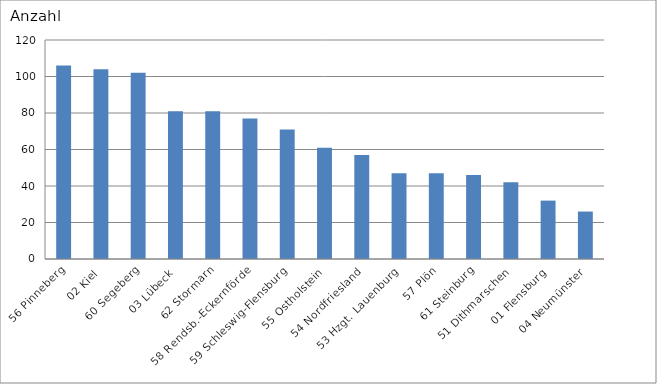
| Category | 56 Pinneberg 02 Kiel 60 Segeberg 03 Lübeck 62 Stormarn 58 Rendsb.-Eckernförde 59 Schleswig-Flensburg 55 Ostholstein 54 Nordfriesland 53 Hzgt. Lauenburg 57 Plön 61 Steinburg 51 Dithmarschen 01 Flensburg 04 Neumünster |
|---|---|
| 56 Pinneberg | 106 |
| 02 Kiel | 104 |
| 60 Segeberg | 102 |
| 03 Lübeck | 81 |
| 62 Stormarn | 81 |
| 58 Rendsb.-Eckernförde | 77 |
| 59 Schleswig-Flensburg | 71 |
| 55 Ostholstein | 61 |
| 54 Nordfriesland | 57 |
| 53 Hzgt. Lauenburg | 47 |
| 57 Plön | 47 |
| 61 Steinburg | 46 |
| 51 Dithmarschen | 42 |
| 01 Flensburg | 32 |
| 04 Neumünster | 26 |